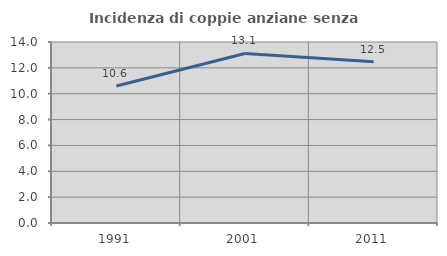
| Category | Incidenza di coppie anziane senza figli  |
|---|---|
| 1991.0 | 10.602 |
| 2001.0 | 13.116 |
| 2011.0 | 12.468 |